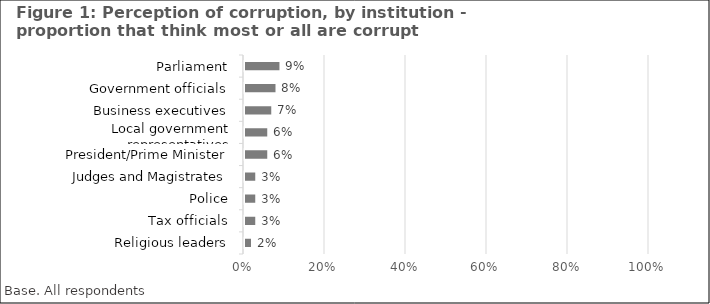
| Category | Series 0 |
|---|---|
| Religious leaders | 0.02 |
| Tax officials | 0.03 |
| Police | 0.03 |
| Judges and Magistrates | 0.03 |
| President/Prime Minister | 0.06 |
| Local government representatives | 0.06 |
| Business executives | 0.07 |
| Government officials | 0.08 |
| Parliament | 0.09 |